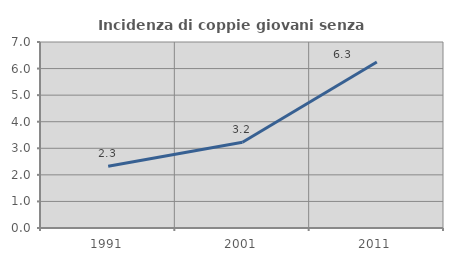
| Category | Incidenza di coppie giovani senza figli |
|---|---|
| 1991.0 | 2.326 |
| 2001.0 | 3.226 |
| 2011.0 | 6.25 |